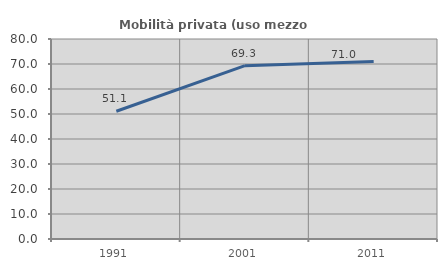
| Category | Mobilità privata (uso mezzo privato) |
|---|---|
| 1991.0 | 51.094 |
| 2001.0 | 69.324 |
| 2011.0 | 70.969 |